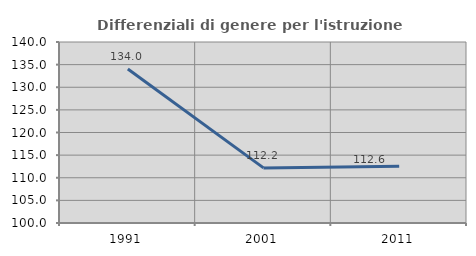
| Category | Differenziali di genere per l'istruzione superiore |
|---|---|
| 1991.0 | 134.04 |
| 2001.0 | 112.178 |
| 2011.0 | 112.551 |